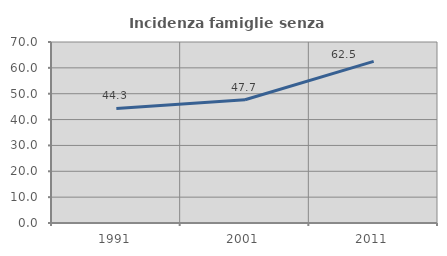
| Category | Incidenza famiglie senza nuclei |
|---|---|
| 1991.0 | 44.318 |
| 2001.0 | 47.674 |
| 2011.0 | 62.5 |